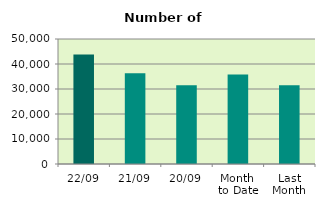
| Category | Series 0 |
|---|---|
| 22/09 | 43842 |
| 21/09 | 36322 |
| 20/09 | 31548 |
| Month 
to Date | 35789.375 |
| Last
Month | 31456 |